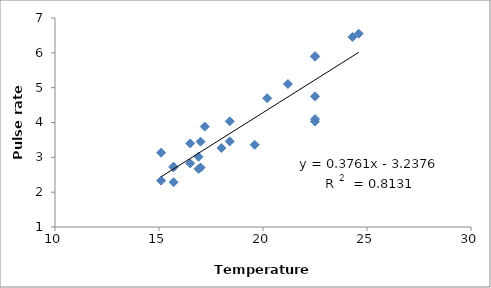
| Category | Series 0 |
|---|---|
| 18.0 | 3.267 |
| 15.7 | 2.713 |
| 15.7 | 2.284 |
| 15.1 | 2.331 |
| 15.1 | 3.134 |
| 18.4 | 3.458 |
| 18.4 | 4.033 |
| 16.9 | 3.017 |
| 16.9 | 2.669 |
| 17.0 | 3.451 |
| 17.0 | 2.706 |
| 17.2 | 3.884 |
| 16.5 | 3.399 |
| 16.5 | 2.828 |
| 21.2 | 5.105 |
| 20.2 | 4.697 |
| 22.5 | 5.903 |
| 22.5 | 4.75 |
| 22.5 | 4.026 |
| 24.6 | 6.55 |
| 24.3 | 6.457 |
| 22.5 | 4.099 |
| 22.5 | 5.89 |
| 19.6 | 3.362 |
| 15.7 | 2.733 |